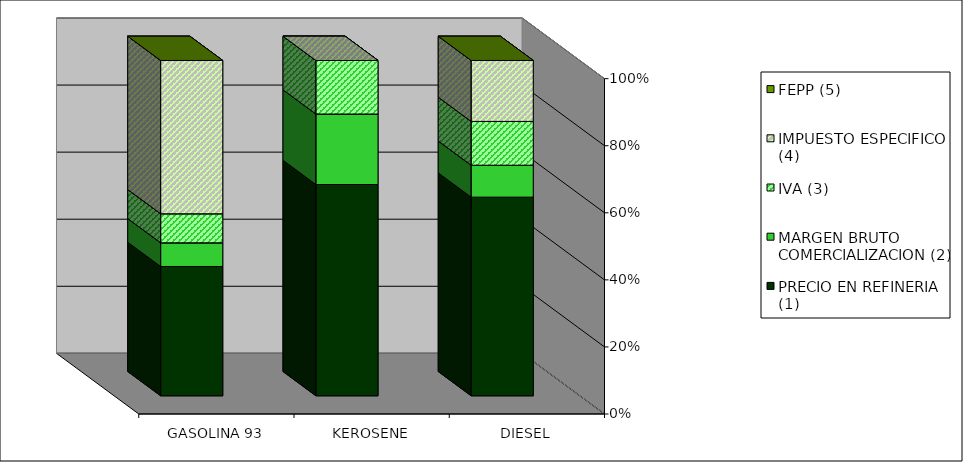
| Category | PRECIO EN REFINERIA (1) | MARGEN BRUTO COMERCIALIZACION (2) | IVA (3) | IMPUESTO ESPECIFICO (4) | FEPP (5) |
|---|---|---|---|---|---|
| GASOLINA 93 | 0.386 | 0.071 | 0.087 | 0.457 | 0 |
| KEROSENE | 0.63 | 0.21 | 0.16 | 0 | 0 |
| DIESEL | 0.592 | 0.095 | 0.131 | 0.182 | 0 |